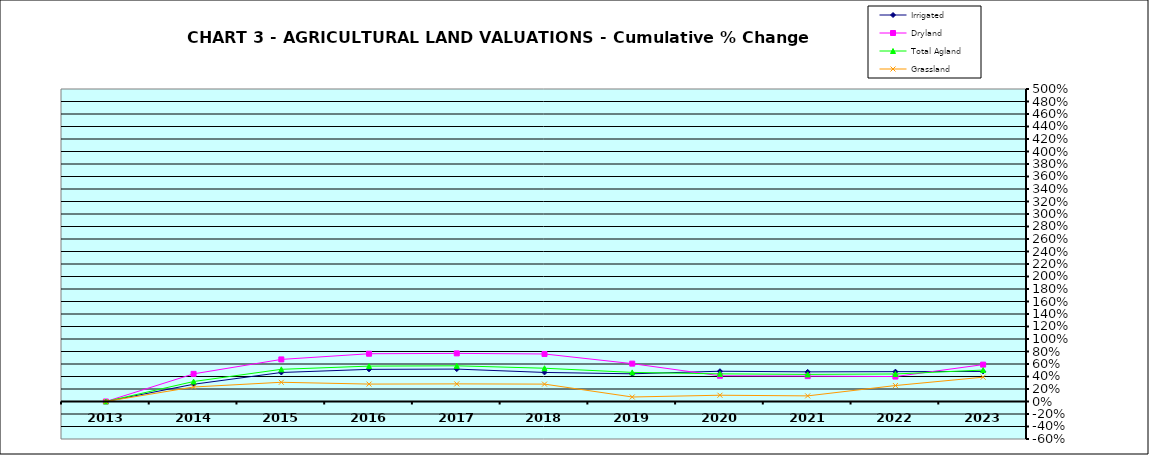
| Category | Irrigated | Dryland | Total Agland | Grassland |
|---|---|---|---|---|
| 2013.0 | 0 | 0 | 0 | 0 |
| 2014.0 | 0.276 | 0.442 | 0.32 | 0.232 |
| 2015.0 | 0.464 | 0.673 | 0.515 | 0.308 |
| 2016.0 | 0.514 | 0.764 | 0.566 | 0.279 |
| 2017.0 | 0.519 | 0.77 | 0.571 | 0.282 |
| 2018.0 | 0.465 | 0.76 | 0.532 | 0.278 |
| 2019.0 | 0.443 | 0.606 | 0.466 | 0.072 |
| 2020.0 | 0.484 | 0.412 | 0.442 | 0.1 |
| 2021.0 | 0.474 | 0.406 | 0.434 | 0.09 |
| 2022.0 | 0.478 | 0.399 | 0.44 | 0.255 |
| 2023.0 | 0.481 | 0.59 | 0.503 | 0.389 |